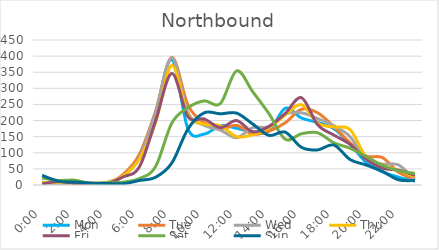
| Category | Mon | Tue | Wed | Thu | Fri | Sat | Sun |
|---|---|---|---|---|---|---|---|
| 0.0 | 9 | 8 | 7 | 7 | 3 | 22 | 30 |
| 0.041667 | 4 | 4 | 3 | 9 | 11 | 14 | 12 |
| 0.083333 | 3 | 0 | 4 | 5 | 5 | 15 | 9 |
| 0.125 | 2 | 4 | 2 | 6 | 2 | 5 | 6 |
| 0.166667 | 8 | 5 | 4 | 8 | 4 | 6 | 5 |
| 0.208333 | 29 | 33 | 29 | 28 | 25 | 9 | 4 |
| 0.25 | 83 | 95 | 85 | 80 | 56 | 20 | 14 |
| 0.291667 | 224 | 229 | 224 | 193 | 199 | 57 | 24 |
| 0.333333 | 390 | 396 | 395 | 371 | 346 | 192 | 68 |
| 0.375 | 174 | 248 | 225 | 218 | 212 | 240 | 174 |
| 0.416667 | 158 | 194 | 185 | 189 | 205 | 261 | 224 |
| 0.458333 | 184 | 174 | 170 | 184 | 178 | 253 | 221 |
| 0.5 | 176 | 185 | 147 | 150 | 200 | 354 | 223 |
| 0.541667 | 165 | 158 | 178 | 156 | 165 | 289 | 189 |
| 0.5833333333333334 | 167 | 167 | 181 | 177 | 182 | 221 | 154 |
| 0.625 | 238 | 193 | 220 | 217 | 222 | 142 | 164 |
| 0.666667 | 208 | 235 | 224 | 249 | 271 | 159 | 117 |
| 0.708333 | 194 | 224 | 206 | 192 | 187 | 162 | 109 |
| 0.75 | 175 | 181 | 184 | 180 | 155 | 131 | 124 |
| 0.791667 | 127 | 131 | 150 | 172 | 126 | 114 | 79 |
| 0.833333 | 70 | 90 | 79 | 86 | 80 | 88 | 62 |
| 0.875 | 41 | 85 | 65 | 61 | 52 | 61 | 42 |
| 0.916667 | 24 | 39 | 62 | 45 | 46 | 44 | 16 |
| 0.958333 | 12 | 19 | 16 | 26 | 30 | 36 | 14 |